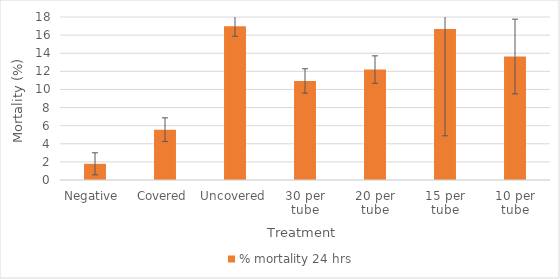
| Category | % mortality 24 hrs |
|---|---|
| Negative  | 1.786 |
| Covered | 5.556 |
| Uncovered | 16.981 |
| 30 per tube | 10.938 |
| 20 per tube | 12.195 |
| 15 per tube | 16.667 |
| 10 per tube | 13.636 |